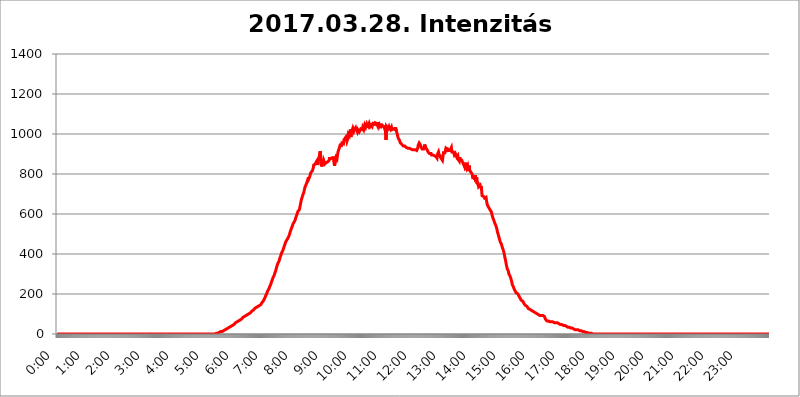
| Category | 2017.03.28. Intenzitás [W/m^2] |
|---|---|
| 0.0 | 0 |
| 0.0006944444444444445 | 0 |
| 0.001388888888888889 | 0 |
| 0.0020833333333333333 | 0 |
| 0.002777777777777778 | 0 |
| 0.003472222222222222 | 0 |
| 0.004166666666666667 | 0 |
| 0.004861111111111111 | 0 |
| 0.005555555555555556 | 0 |
| 0.0062499999999999995 | 0 |
| 0.006944444444444444 | 0 |
| 0.007638888888888889 | 0 |
| 0.008333333333333333 | 0 |
| 0.009027777777777779 | 0 |
| 0.009722222222222222 | 0 |
| 0.010416666666666666 | 0 |
| 0.011111111111111112 | 0 |
| 0.011805555555555555 | 0 |
| 0.012499999999999999 | 0 |
| 0.013194444444444444 | 0 |
| 0.013888888888888888 | 0 |
| 0.014583333333333332 | 0 |
| 0.015277777777777777 | 0 |
| 0.015972222222222224 | 0 |
| 0.016666666666666666 | 0 |
| 0.017361111111111112 | 0 |
| 0.018055555555555557 | 0 |
| 0.01875 | 0 |
| 0.019444444444444445 | 0 |
| 0.02013888888888889 | 0 |
| 0.020833333333333332 | 0 |
| 0.02152777777777778 | 0 |
| 0.022222222222222223 | 0 |
| 0.02291666666666667 | 0 |
| 0.02361111111111111 | 0 |
| 0.024305555555555556 | 0 |
| 0.024999999999999998 | 0 |
| 0.025694444444444447 | 0 |
| 0.02638888888888889 | 0 |
| 0.027083333333333334 | 0 |
| 0.027777777777777776 | 0 |
| 0.02847222222222222 | 0 |
| 0.029166666666666664 | 0 |
| 0.029861111111111113 | 0 |
| 0.030555555555555555 | 0 |
| 0.03125 | 0 |
| 0.03194444444444445 | 0 |
| 0.03263888888888889 | 0 |
| 0.03333333333333333 | 0 |
| 0.034027777777777775 | 0 |
| 0.034722222222222224 | 0 |
| 0.035416666666666666 | 0 |
| 0.036111111111111115 | 0 |
| 0.03680555555555556 | 0 |
| 0.0375 | 0 |
| 0.03819444444444444 | 0 |
| 0.03888888888888889 | 0 |
| 0.03958333333333333 | 0 |
| 0.04027777777777778 | 0 |
| 0.04097222222222222 | 0 |
| 0.041666666666666664 | 0 |
| 0.042361111111111106 | 0 |
| 0.04305555555555556 | 0 |
| 0.043750000000000004 | 0 |
| 0.044444444444444446 | 0 |
| 0.04513888888888889 | 0 |
| 0.04583333333333334 | 0 |
| 0.04652777777777778 | 0 |
| 0.04722222222222222 | 0 |
| 0.04791666666666666 | 0 |
| 0.04861111111111111 | 0 |
| 0.049305555555555554 | 0 |
| 0.049999999999999996 | 0 |
| 0.05069444444444445 | 0 |
| 0.051388888888888894 | 0 |
| 0.052083333333333336 | 0 |
| 0.05277777777777778 | 0 |
| 0.05347222222222222 | 0 |
| 0.05416666666666667 | 0 |
| 0.05486111111111111 | 0 |
| 0.05555555555555555 | 0 |
| 0.05625 | 0 |
| 0.05694444444444444 | 0 |
| 0.057638888888888885 | 0 |
| 0.05833333333333333 | 0 |
| 0.05902777777777778 | 0 |
| 0.059722222222222225 | 0 |
| 0.06041666666666667 | 0 |
| 0.061111111111111116 | 0 |
| 0.06180555555555556 | 0 |
| 0.0625 | 0 |
| 0.06319444444444444 | 0 |
| 0.06388888888888888 | 0 |
| 0.06458333333333334 | 0 |
| 0.06527777777777778 | 0 |
| 0.06597222222222222 | 0 |
| 0.06666666666666667 | 0 |
| 0.06736111111111111 | 0 |
| 0.06805555555555555 | 0 |
| 0.06874999999999999 | 0 |
| 0.06944444444444443 | 0 |
| 0.07013888888888889 | 0 |
| 0.07083333333333333 | 0 |
| 0.07152777777777779 | 0 |
| 0.07222222222222223 | 0 |
| 0.07291666666666667 | 0 |
| 0.07361111111111111 | 0 |
| 0.07430555555555556 | 0 |
| 0.075 | 0 |
| 0.07569444444444444 | 0 |
| 0.0763888888888889 | 0 |
| 0.07708333333333334 | 0 |
| 0.07777777777777778 | 0 |
| 0.07847222222222222 | 0 |
| 0.07916666666666666 | 0 |
| 0.0798611111111111 | 0 |
| 0.08055555555555556 | 0 |
| 0.08125 | 0 |
| 0.08194444444444444 | 0 |
| 0.08263888888888889 | 0 |
| 0.08333333333333333 | 0 |
| 0.08402777777777777 | 0 |
| 0.08472222222222221 | 0 |
| 0.08541666666666665 | 0 |
| 0.08611111111111112 | 0 |
| 0.08680555555555557 | 0 |
| 0.08750000000000001 | 0 |
| 0.08819444444444445 | 0 |
| 0.08888888888888889 | 0 |
| 0.08958333333333333 | 0 |
| 0.09027777777777778 | 0 |
| 0.09097222222222222 | 0 |
| 0.09166666666666667 | 0 |
| 0.09236111111111112 | 0 |
| 0.09305555555555556 | 0 |
| 0.09375 | 0 |
| 0.09444444444444444 | 0 |
| 0.09513888888888888 | 0 |
| 0.09583333333333333 | 0 |
| 0.09652777777777777 | 0 |
| 0.09722222222222222 | 0 |
| 0.09791666666666667 | 0 |
| 0.09861111111111111 | 0 |
| 0.09930555555555555 | 0 |
| 0.09999999999999999 | 0 |
| 0.10069444444444443 | 0 |
| 0.1013888888888889 | 0 |
| 0.10208333333333335 | 0 |
| 0.10277777777777779 | 0 |
| 0.10347222222222223 | 0 |
| 0.10416666666666667 | 0 |
| 0.10486111111111111 | 0 |
| 0.10555555555555556 | 0 |
| 0.10625 | 0 |
| 0.10694444444444444 | 0 |
| 0.1076388888888889 | 0 |
| 0.10833333333333334 | 0 |
| 0.10902777777777778 | 0 |
| 0.10972222222222222 | 0 |
| 0.1111111111111111 | 0 |
| 0.11180555555555556 | 0 |
| 0.11180555555555556 | 0 |
| 0.1125 | 0 |
| 0.11319444444444444 | 0 |
| 0.11388888888888889 | 0 |
| 0.11458333333333333 | 0 |
| 0.11527777777777777 | 0 |
| 0.11597222222222221 | 0 |
| 0.11666666666666665 | 0 |
| 0.1173611111111111 | 0 |
| 0.11805555555555557 | 0 |
| 0.11944444444444445 | 0 |
| 0.12013888888888889 | 0 |
| 0.12083333333333333 | 0 |
| 0.12152777777777778 | 0 |
| 0.12222222222222223 | 0 |
| 0.12291666666666667 | 0 |
| 0.12291666666666667 | 0 |
| 0.12361111111111112 | 0 |
| 0.12430555555555556 | 0 |
| 0.125 | 0 |
| 0.12569444444444444 | 0 |
| 0.12638888888888888 | 0 |
| 0.12708333333333333 | 0 |
| 0.16875 | 0 |
| 0.12847222222222224 | 0 |
| 0.12916666666666668 | 0 |
| 0.12986111111111112 | 0 |
| 0.13055555555555556 | 0 |
| 0.13125 | 0 |
| 0.13194444444444445 | 0 |
| 0.1326388888888889 | 0 |
| 0.13333333333333333 | 0 |
| 0.13402777777777777 | 0 |
| 0.13402777777777777 | 0 |
| 0.13472222222222222 | 0 |
| 0.13541666666666666 | 0 |
| 0.1361111111111111 | 0 |
| 0.13749999999999998 | 0 |
| 0.13819444444444443 | 0 |
| 0.1388888888888889 | 0 |
| 0.13958333333333334 | 0 |
| 0.14027777777777778 | 0 |
| 0.14097222222222222 | 0 |
| 0.14166666666666666 | 0 |
| 0.1423611111111111 | 0 |
| 0.14305555555555557 | 0 |
| 0.14375000000000002 | 0 |
| 0.14444444444444446 | 0 |
| 0.1451388888888889 | 0 |
| 0.1451388888888889 | 0 |
| 0.14652777777777778 | 0 |
| 0.14722222222222223 | 0 |
| 0.14791666666666667 | 0 |
| 0.1486111111111111 | 0 |
| 0.14930555555555555 | 0 |
| 0.15 | 0 |
| 0.15069444444444444 | 0 |
| 0.15138888888888888 | 0 |
| 0.15208333333333332 | 0 |
| 0.15277777777777776 | 0 |
| 0.15347222222222223 | 0 |
| 0.15416666666666667 | 0 |
| 0.15486111111111112 | 0 |
| 0.15555555555555556 | 0 |
| 0.15625 | 0 |
| 0.15694444444444444 | 0 |
| 0.15763888888888888 | 0 |
| 0.15833333333333333 | 0 |
| 0.15902777777777777 | 0 |
| 0.15972222222222224 | 0 |
| 0.16041666666666668 | 0 |
| 0.16111111111111112 | 0 |
| 0.16180555555555556 | 0 |
| 0.1625 | 0 |
| 0.16319444444444445 | 0 |
| 0.1638888888888889 | 0 |
| 0.16458333333333333 | 0 |
| 0.16527777777777777 | 0 |
| 0.16597222222222222 | 0 |
| 0.16666666666666666 | 0 |
| 0.1673611111111111 | 0 |
| 0.16805555555555554 | 0 |
| 0.16874999999999998 | 0 |
| 0.16944444444444443 | 0 |
| 0.17013888888888887 | 0 |
| 0.1708333333333333 | 0 |
| 0.17152777777777775 | 0 |
| 0.17222222222222225 | 0 |
| 0.1729166666666667 | 0 |
| 0.17361111111111113 | 0 |
| 0.17430555555555557 | 0 |
| 0.17500000000000002 | 0 |
| 0.17569444444444446 | 0 |
| 0.1763888888888889 | 0 |
| 0.17708333333333334 | 0 |
| 0.17777777777777778 | 0 |
| 0.17847222222222223 | 0 |
| 0.17916666666666667 | 0 |
| 0.1798611111111111 | 0 |
| 0.18055555555555555 | 0 |
| 0.18125 | 0 |
| 0.18194444444444444 | 0 |
| 0.1826388888888889 | 0 |
| 0.18333333333333335 | 0 |
| 0.1840277777777778 | 0 |
| 0.18472222222222223 | 0 |
| 0.18541666666666667 | 0 |
| 0.18611111111111112 | 0 |
| 0.18680555555555556 | 0 |
| 0.1875 | 0 |
| 0.18819444444444444 | 0 |
| 0.18888888888888888 | 0 |
| 0.18958333333333333 | 0 |
| 0.19027777777777777 | 0 |
| 0.1909722222222222 | 0 |
| 0.19166666666666665 | 0 |
| 0.19236111111111112 | 0 |
| 0.19305555555555554 | 0 |
| 0.19375 | 0 |
| 0.19444444444444445 | 0 |
| 0.1951388888888889 | 0 |
| 0.19583333333333333 | 0 |
| 0.19652777777777777 | 0 |
| 0.19722222222222222 | 0 |
| 0.19791666666666666 | 0 |
| 0.1986111111111111 | 0 |
| 0.19930555555555554 | 0 |
| 0.19999999999999998 | 0 |
| 0.20069444444444443 | 0 |
| 0.20138888888888887 | 0 |
| 0.2020833333333333 | 0 |
| 0.2027777777777778 | 0 |
| 0.2034722222222222 | 0 |
| 0.2041666666666667 | 0 |
| 0.20486111111111113 | 0 |
| 0.20555555555555557 | 0 |
| 0.20625000000000002 | 0 |
| 0.20694444444444446 | 0 |
| 0.2076388888888889 | 0 |
| 0.20833333333333334 | 0 |
| 0.20902777777777778 | 0 |
| 0.20972222222222223 | 0 |
| 0.21041666666666667 | 0 |
| 0.2111111111111111 | 0 |
| 0.21180555555555555 | 0 |
| 0.2125 | 0 |
| 0.21319444444444444 | 0 |
| 0.2138888888888889 | 0 |
| 0.21458333333333335 | 0 |
| 0.2152777777777778 | 0 |
| 0.21597222222222223 | 0 |
| 0.21666666666666667 | 0 |
| 0.21736111111111112 | 0 |
| 0.21805555555555556 | 0 |
| 0.21875 | 0 |
| 0.21944444444444444 | 0 |
| 0.22013888888888888 | 0 |
| 0.22083333333333333 | 0 |
| 0.22152777777777777 | 0 |
| 0.2222222222222222 | 3.525 |
| 0.22291666666666665 | 3.525 |
| 0.2236111111111111 | 3.525 |
| 0.22430555555555556 | 3.525 |
| 0.225 | 3.525 |
| 0.22569444444444445 | 3.525 |
| 0.2263888888888889 | 3.525 |
| 0.22708333333333333 | 7.887 |
| 0.22777777777777777 | 7.887 |
| 0.22847222222222222 | 7.887 |
| 0.22916666666666666 | 12.257 |
| 0.2298611111111111 | 12.257 |
| 0.23055555555555554 | 12.257 |
| 0.23124999999999998 | 12.257 |
| 0.23194444444444443 | 12.257 |
| 0.23263888888888887 | 16.636 |
| 0.2333333333333333 | 16.636 |
| 0.2340277777777778 | 16.636 |
| 0.2347222222222222 | 21.024 |
| 0.2354166666666667 | 21.024 |
| 0.23611111111111113 | 21.024 |
| 0.23680555555555557 | 25.419 |
| 0.23750000000000002 | 25.419 |
| 0.23819444444444446 | 25.419 |
| 0.2388888888888889 | 29.823 |
| 0.23958333333333334 | 29.823 |
| 0.24027777777777778 | 29.823 |
| 0.24097222222222223 | 34.234 |
| 0.24166666666666667 | 34.234 |
| 0.2423611111111111 | 38.653 |
| 0.24305555555555555 | 38.653 |
| 0.24375 | 38.653 |
| 0.24444444444444446 | 43.079 |
| 0.24513888888888888 | 43.079 |
| 0.24583333333333335 | 43.079 |
| 0.2465277777777778 | 47.511 |
| 0.24722222222222223 | 47.511 |
| 0.24791666666666667 | 47.511 |
| 0.24861111111111112 | 51.951 |
| 0.24930555555555556 | 51.951 |
| 0.25 | 56.398 |
| 0.25069444444444444 | 56.398 |
| 0.2513888888888889 | 56.398 |
| 0.2520833333333333 | 60.85 |
| 0.25277777777777777 | 60.85 |
| 0.2534722222222222 | 65.31 |
| 0.25416666666666665 | 65.31 |
| 0.2548611111111111 | 65.31 |
| 0.2555555555555556 | 65.31 |
| 0.25625000000000003 | 69.775 |
| 0.2569444444444445 | 74.246 |
| 0.2576388888888889 | 74.246 |
| 0.25833333333333336 | 74.246 |
| 0.2590277777777778 | 78.722 |
| 0.25972222222222224 | 78.722 |
| 0.2604166666666667 | 83.205 |
| 0.2611111111111111 | 83.205 |
| 0.26180555555555557 | 83.205 |
| 0.2625 | 87.692 |
| 0.26319444444444445 | 87.692 |
| 0.2638888888888889 | 92.184 |
| 0.26458333333333334 | 92.184 |
| 0.2652777777777778 | 92.184 |
| 0.2659722222222222 | 96.682 |
| 0.26666666666666666 | 96.682 |
| 0.2673611111111111 | 101.184 |
| 0.26805555555555555 | 101.184 |
| 0.26875 | 101.184 |
| 0.26944444444444443 | 101.184 |
| 0.2701388888888889 | 105.69 |
| 0.2708333333333333 | 105.69 |
| 0.27152777777777776 | 110.201 |
| 0.2722222222222222 | 110.201 |
| 0.27291666666666664 | 114.716 |
| 0.2736111111111111 | 119.235 |
| 0.2743055555555555 | 119.235 |
| 0.27499999999999997 | 119.235 |
| 0.27569444444444446 | 123.758 |
| 0.27638888888888885 | 123.758 |
| 0.27708333333333335 | 128.284 |
| 0.2777777777777778 | 128.284 |
| 0.27847222222222223 | 128.284 |
| 0.2791666666666667 | 132.814 |
| 0.2798611111111111 | 132.814 |
| 0.28055555555555556 | 137.347 |
| 0.28125 | 137.347 |
| 0.28194444444444444 | 137.347 |
| 0.2826388888888889 | 137.347 |
| 0.2833333333333333 | 141.884 |
| 0.28402777777777777 | 141.884 |
| 0.2847222222222222 | 146.423 |
| 0.28541666666666665 | 146.423 |
| 0.28611111111111115 | 150.964 |
| 0.28680555555555554 | 155.509 |
| 0.28750000000000003 | 155.509 |
| 0.2881944444444445 | 160.056 |
| 0.2888888888888889 | 164.605 |
| 0.28958333333333336 | 164.605 |
| 0.2902777777777778 | 169.156 |
| 0.29097222222222224 | 178.264 |
| 0.2916666666666667 | 182.82 |
| 0.2923611111111111 | 191.937 |
| 0.29305555555555557 | 196.497 |
| 0.29375 | 201.058 |
| 0.29444444444444445 | 210.182 |
| 0.2951388888888889 | 210.182 |
| 0.29583333333333334 | 219.309 |
| 0.2965277777777778 | 223.873 |
| 0.2972222222222222 | 228.436 |
| 0.29791666666666666 | 237.564 |
| 0.2986111111111111 | 242.127 |
| 0.29930555555555555 | 246.689 |
| 0.3 | 255.813 |
| 0.30069444444444443 | 260.373 |
| 0.3013888888888889 | 269.49 |
| 0.3020833333333333 | 274.047 |
| 0.30277777777777776 | 283.156 |
| 0.3034722222222222 | 287.709 |
| 0.30416666666666664 | 292.259 |
| 0.3048611111111111 | 301.354 |
| 0.3055555555555555 | 305.898 |
| 0.30624999999999997 | 314.98 |
| 0.3069444444444444 | 324.052 |
| 0.3076388888888889 | 333.113 |
| 0.30833333333333335 | 342.162 |
| 0.3090277777777778 | 346.682 |
| 0.30972222222222223 | 355.712 |
| 0.3104166666666667 | 360.221 |
| 0.3111111111111111 | 364.728 |
| 0.31180555555555556 | 369.23 |
| 0.3125 | 382.715 |
| 0.31319444444444444 | 387.202 |
| 0.3138888888888889 | 396.164 |
| 0.3145833333333333 | 405.108 |
| 0.31527777777777777 | 405.108 |
| 0.3159722222222222 | 414.035 |
| 0.31666666666666665 | 418.492 |
| 0.31736111111111115 | 427.39 |
| 0.31805555555555554 | 436.27 |
| 0.31875000000000003 | 440.702 |
| 0.3194444444444445 | 449.551 |
| 0.3201388888888889 | 458.38 |
| 0.32083333333333336 | 458.38 |
| 0.3215277777777778 | 467.187 |
| 0.32222222222222224 | 471.582 |
| 0.3229166666666667 | 475.972 |
| 0.3236111111111111 | 480.356 |
| 0.32430555555555557 | 484.735 |
| 0.325 | 489.108 |
| 0.32569444444444445 | 497.836 |
| 0.3263888888888889 | 506.542 |
| 0.32708333333333334 | 515.223 |
| 0.3277777777777778 | 519.555 |
| 0.3284722222222222 | 528.2 |
| 0.32916666666666666 | 532.513 |
| 0.3298611111111111 | 541.121 |
| 0.33055555555555555 | 549.704 |
| 0.33125 | 553.986 |
| 0.33194444444444443 | 558.261 |
| 0.3326388888888889 | 558.261 |
| 0.3333333333333333 | 566.793 |
| 0.3340277777777778 | 575.299 |
| 0.3347222222222222 | 583.779 |
| 0.3354166666666667 | 588.009 |
| 0.3361111111111111 | 596.45 |
| 0.3368055555555556 | 600.661 |
| 0.33749999999999997 | 613.252 |
| 0.33819444444444446 | 613.252 |
| 0.33888888888888885 | 617.436 |
| 0.33958333333333335 | 621.613 |
| 0.34027777777777773 | 634.105 |
| 0.34097222222222223 | 646.537 |
| 0.3416666666666666 | 658.909 |
| 0.3423611111111111 | 671.22 |
| 0.3430555555555555 | 675.311 |
| 0.34375 | 687.544 |
| 0.3444444444444445 | 695.666 |
| 0.3451388888888889 | 699.717 |
| 0.3458333333333334 | 707.8 |
| 0.34652777777777777 | 719.877 |
| 0.34722222222222227 | 731.896 |
| 0.34791666666666665 | 735.89 |
| 0.34861111111111115 | 743.859 |
| 0.34930555555555554 | 743.859 |
| 0.35000000000000003 | 755.766 |
| 0.3506944444444444 | 759.723 |
| 0.3513888888888889 | 771.559 |
| 0.3520833333333333 | 783.342 |
| 0.3527777777777778 | 775.492 |
| 0.3534722222222222 | 775.492 |
| 0.3541666666666667 | 787.258 |
| 0.3548611111111111 | 791.169 |
| 0.35555555555555557 | 806.757 |
| 0.35625 | 806.757 |
| 0.35694444444444445 | 810.641 |
| 0.3576388888888889 | 814.519 |
| 0.35833333333333334 | 818.392 |
| 0.3590277777777778 | 829.981 |
| 0.3597222222222222 | 845.365 |
| 0.36041666666666666 | 841.526 |
| 0.3611111111111111 | 841.526 |
| 0.36180555555555555 | 849.199 |
| 0.3625 | 853.029 |
| 0.36319444444444443 | 860.676 |
| 0.3638888888888889 | 860.676 |
| 0.3645833333333333 | 868.305 |
| 0.3652777777777778 | 845.365 |
| 0.3659722222222222 | 856.855 |
| 0.3666666666666667 | 872.114 |
| 0.3673611111111111 | 868.305 |
| 0.3680555555555556 | 868.305 |
| 0.36874999999999997 | 913.766 |
| 0.36944444444444446 | 891.099 |
| 0.37013888888888885 | 887.309 |
| 0.37083333333333335 | 837.682 |
| 0.37152777777777773 | 860.676 |
| 0.37222222222222223 | 845.365 |
| 0.3729166666666666 | 845.365 |
| 0.3736111111111111 | 868.305 |
| 0.3743055555555555 | 860.676 |
| 0.375 | 849.199 |
| 0.3756944444444445 | 853.029 |
| 0.3763888888888889 | 853.029 |
| 0.3770833333333334 | 856.855 |
| 0.37777777777777777 | 860.676 |
| 0.37847222222222227 | 860.676 |
| 0.37916666666666665 | 860.676 |
| 0.37986111111111115 | 864.493 |
| 0.38055555555555554 | 864.493 |
| 0.38125000000000003 | 868.305 |
| 0.3819444444444444 | 883.516 |
| 0.3826388888888889 | 875.918 |
| 0.3833333333333333 | 875.918 |
| 0.3840277777777778 | 879.719 |
| 0.3847222222222222 | 879.719 |
| 0.3854166666666667 | 879.719 |
| 0.3861111111111111 | 883.516 |
| 0.38680555555555557 | 875.918 |
| 0.3875 | 887.309 |
| 0.38819444444444445 | 883.516 |
| 0.3888888888888889 | 841.526 |
| 0.38958333333333334 | 837.682 |
| 0.3902777777777778 | 872.114 |
| 0.3909722222222222 | 883.516 |
| 0.39166666666666666 | 887.309 |
| 0.3923611111111111 | 875.918 |
| 0.39305555555555555 | 894.885 |
| 0.39375 | 909.996 |
| 0.39444444444444443 | 909.996 |
| 0.3951388888888889 | 925.06 |
| 0.3958333333333333 | 925.06 |
| 0.3965277777777778 | 940.082 |
| 0.3972222222222222 | 951.327 |
| 0.3979166666666667 | 936.33 |
| 0.3986111111111111 | 943.832 |
| 0.3993055555555556 | 955.071 |
| 0.39999999999999997 | 958.814 |
| 0.40069444444444446 | 951.327 |
| 0.40138888888888885 | 951.327 |
| 0.40208333333333335 | 970.034 |
| 0.40277777777777773 | 966.295 |
| 0.40347222222222223 | 966.295 |
| 0.4041666666666666 | 981.244 |
| 0.4048611111111111 | 966.295 |
| 0.4055555555555555 | 973.772 |
| 0.40625 | 962.555 |
| 0.4069444444444445 | 962.555 |
| 0.4076388888888889 | 977.508 |
| 0.4083333333333334 | 999.916 |
| 0.40902777777777777 | 999.916 |
| 0.40972222222222227 | 992.448 |
| 0.41041666666666665 | 988.714 |
| 0.41111111111111115 | 1022.323 |
| 0.41180555555555554 | 984.98 |
| 0.41250000000000003 | 1003.65 |
| 0.4131944444444444 | 1014.852 |
| 0.4138888888888889 | 1011.118 |
| 0.4145833333333333 | 1029.798 |
| 0.4152777777777778 | 1033.537 |
| 0.4159722222222222 | 1014.852 |
| 0.4166666666666667 | 1022.323 |
| 0.4173611111111111 | 1022.323 |
| 0.41805555555555557 | 1029.798 |
| 0.41875 | 1014.852 |
| 0.41944444444444445 | 1022.323 |
| 0.4201388888888889 | 1026.06 |
| 0.42083333333333334 | 1011.118 |
| 0.4215277777777778 | 1022.323 |
| 0.4222222222222222 | 1022.323 |
| 0.42291666666666666 | 1022.323 |
| 0.4236111111111111 | 1011.118 |
| 0.42430555555555555 | 1011.118 |
| 0.425 | 1011.118 |
| 0.42569444444444443 | 1026.06 |
| 0.4263888888888889 | 1022.323 |
| 0.4270833333333333 | 1029.798 |
| 0.4277777777777778 | 1022.323 |
| 0.4284722222222222 | 1033.537 |
| 0.4291666666666667 | 1033.537 |
| 0.4298611111111111 | 1022.323 |
| 0.4305555555555556 | 1033.537 |
| 0.43124999999999997 | 1044.762 |
| 0.43194444444444446 | 1041.019 |
| 0.43263888888888885 | 1033.537 |
| 0.43333333333333335 | 1033.537 |
| 0.43402777777777773 | 1048.508 |
| 0.43472222222222223 | 1041.019 |
| 0.4354166666666666 | 1029.798 |
| 0.4361111111111111 | 1052.255 |
| 0.4368055555555555 | 1044.762 |
| 0.4375 | 1052.255 |
| 0.4381944444444445 | 1052.255 |
| 0.4388888888888889 | 1037.277 |
| 0.4395833333333334 | 1037.277 |
| 0.44027777777777777 | 1044.762 |
| 0.44097222222222227 | 1044.762 |
| 0.44166666666666665 | 1037.277 |
| 0.44236111111111115 | 1044.762 |
| 0.44305555555555554 | 1052.255 |
| 0.44375000000000003 | 1048.508 |
| 0.4444444444444444 | 1052.255 |
| 0.4451388888888889 | 1048.508 |
| 0.4458333333333333 | 1056.004 |
| 0.4465277777777778 | 1052.255 |
| 0.4472222222222222 | 1056.004 |
| 0.4479166666666667 | 1052.255 |
| 0.4486111111111111 | 1052.255 |
| 0.44930555555555557 | 1041.019 |
| 0.45 | 1059.756 |
| 0.45069444444444445 | 1048.508 |
| 0.4513888888888889 | 1041.019 |
| 0.45208333333333334 | 1048.508 |
| 0.4527777777777778 | 1044.762 |
| 0.4534722222222222 | 1044.762 |
| 0.45416666666666666 | 1037.277 |
| 0.4548611111111111 | 1041.019 |
| 0.45555555555555555 | 1044.762 |
| 0.45625 | 1044.762 |
| 0.45694444444444443 | 1044.762 |
| 0.4576388888888889 | 1037.277 |
| 0.4583333333333333 | 1033.537 |
| 0.4590277777777778 | 1029.798 |
| 0.4597222222222222 | 1044.762 |
| 0.4604166666666667 | 1003.65 |
| 0.4611111111111111 | 970.034 |
| 0.4618055555555556 | 1037.277 |
| 0.46249999999999997 | 1041.019 |
| 0.46319444444444446 | 1037.277 |
| 0.46388888888888885 | 1026.06 |
| 0.46458333333333335 | 1022.323 |
| 0.46527777777777773 | 1037.277 |
| 0.46597222222222223 | 1029.798 |
| 0.4666666666666666 | 1026.06 |
| 0.4673611111111111 | 1022.323 |
| 0.4680555555555555 | 1022.323 |
| 0.46875 | 1033.537 |
| 0.4694444444444445 | 1022.323 |
| 0.4701388888888889 | 1026.06 |
| 0.4708333333333334 | 1026.06 |
| 0.47152777777777777 | 1026.06 |
| 0.47222222222222227 | 1029.798 |
| 0.47291666666666665 | 1022.323 |
| 0.47361111111111115 | 1022.323 |
| 0.47430555555555554 | 1033.537 |
| 0.47500000000000003 | 1033.537 |
| 0.4756944444444444 | 1014.852 |
| 0.4763888888888889 | 1011.118 |
| 0.4770833333333333 | 996.182 |
| 0.4777777777777778 | 984.98 |
| 0.4784722222222222 | 977.508 |
| 0.4791666666666667 | 973.772 |
| 0.4798611111111111 | 970.034 |
| 0.48055555555555557 | 962.555 |
| 0.48125 | 955.071 |
| 0.48194444444444445 | 955.071 |
| 0.4826388888888889 | 955.071 |
| 0.48333333333333334 | 947.58 |
| 0.4840277777777778 | 947.58 |
| 0.4847222222222222 | 943.832 |
| 0.48541666666666666 | 940.082 |
| 0.4861111111111111 | 936.33 |
| 0.48680555555555555 | 940.082 |
| 0.4875 | 940.082 |
| 0.48819444444444443 | 940.082 |
| 0.4888888888888889 | 936.33 |
| 0.4895833333333333 | 932.576 |
| 0.4902777777777778 | 932.576 |
| 0.4909722222222222 | 928.819 |
| 0.4916666666666667 | 928.819 |
| 0.4923611111111111 | 928.819 |
| 0.4930555555555556 | 925.06 |
| 0.49374999999999997 | 928.819 |
| 0.49444444444444446 | 925.06 |
| 0.49513888888888885 | 925.06 |
| 0.49583333333333335 | 925.06 |
| 0.49652777777777773 | 928.819 |
| 0.49722222222222223 | 928.819 |
| 0.4979166666666666 | 921.298 |
| 0.4986111111111111 | 921.298 |
| 0.4993055555555555 | 921.298 |
| 0.5 | 921.298 |
| 0.5006944444444444 | 925.06 |
| 0.5013888888888889 | 921.298 |
| 0.5020833333333333 | 921.298 |
| 0.5027777777777778 | 917.534 |
| 0.5034722222222222 | 921.298 |
| 0.5041666666666667 | 917.534 |
| 0.5048611111111111 | 917.534 |
| 0.5055555555555555 | 928.819 |
| 0.50625 | 943.832 |
| 0.5069444444444444 | 947.58 |
| 0.5076388888888889 | 955.071 |
| 0.5083333333333333 | 951.327 |
| 0.5090277777777777 | 947.58 |
| 0.5097222222222222 | 940.082 |
| 0.5104166666666666 | 932.576 |
| 0.5111111111111112 | 932.576 |
| 0.5118055555555555 | 925.06 |
| 0.5125000000000001 | 921.298 |
| 0.5131944444444444 | 921.298 |
| 0.513888888888889 | 925.06 |
| 0.5145833333333333 | 932.576 |
| 0.5152777777777778 | 947.58 |
| 0.5159722222222222 | 943.832 |
| 0.5166666666666667 | 932.576 |
| 0.517361111111111 | 932.576 |
| 0.5180555555555556 | 928.819 |
| 0.5187499999999999 | 921.298 |
| 0.5194444444444445 | 917.534 |
| 0.5201388888888888 | 909.996 |
| 0.5208333333333334 | 909.996 |
| 0.5215277777777778 | 909.996 |
| 0.5222222222222223 | 902.447 |
| 0.5229166666666667 | 902.447 |
| 0.5236111111111111 | 898.668 |
| 0.5243055555555556 | 902.447 |
| 0.525 | 894.885 |
| 0.5256944444444445 | 894.885 |
| 0.5263888888888889 | 894.885 |
| 0.5270833333333333 | 894.885 |
| 0.5277777777777778 | 894.885 |
| 0.5284722222222222 | 894.885 |
| 0.5291666666666667 | 891.099 |
| 0.5298611111111111 | 891.099 |
| 0.5305555555555556 | 887.309 |
| 0.53125 | 887.309 |
| 0.5319444444444444 | 883.516 |
| 0.5326388888888889 | 879.719 |
| 0.5333333333333333 | 898.668 |
| 0.5340277777777778 | 894.885 |
| 0.5347222222222222 | 909.996 |
| 0.5354166666666667 | 898.668 |
| 0.5361111111111111 | 894.885 |
| 0.5368055555555555 | 891.099 |
| 0.5375 | 883.516 |
| 0.5381944444444444 | 879.719 |
| 0.5388888888888889 | 875.918 |
| 0.5395833333333333 | 872.114 |
| 0.5402777777777777 | 868.305 |
| 0.5409722222222222 | 868.305 |
| 0.5416666666666666 | 906.223 |
| 0.5423611111111112 | 902.447 |
| 0.5430555555555555 | 909.996 |
| 0.5437500000000001 | 906.223 |
| 0.5444444444444444 | 917.534 |
| 0.545138888888889 | 909.996 |
| 0.5458333333333333 | 928.819 |
| 0.5465277777777778 | 932.576 |
| 0.5472222222222222 | 928.819 |
| 0.5479166666666667 | 925.06 |
| 0.548611111111111 | 917.534 |
| 0.5493055555555556 | 917.534 |
| 0.5499999999999999 | 913.766 |
| 0.5506944444444445 | 917.534 |
| 0.5513888888888888 | 917.534 |
| 0.5520833333333334 | 917.534 |
| 0.5527777777777778 | 932.576 |
| 0.5534722222222223 | 909.996 |
| 0.5541666666666667 | 906.223 |
| 0.5548611111111111 | 913.766 |
| 0.5555555555555556 | 909.996 |
| 0.55625 | 906.223 |
| 0.5569444444444445 | 894.885 |
| 0.5576388888888889 | 894.885 |
| 0.5583333333333333 | 902.447 |
| 0.5590277777777778 | 898.668 |
| 0.5597222222222222 | 902.447 |
| 0.5604166666666667 | 883.516 |
| 0.5611111111111111 | 887.309 |
| 0.5618055555555556 | 891.099 |
| 0.5625 | 872.114 |
| 0.5631944444444444 | 868.305 |
| 0.5638888888888889 | 864.493 |
| 0.5645833333333333 | 883.516 |
| 0.5652777777777778 | 868.305 |
| 0.5659722222222222 | 868.305 |
| 0.5666666666666667 | 864.493 |
| 0.5673611111111111 | 868.305 |
| 0.5680555555555555 | 872.114 |
| 0.56875 | 856.855 |
| 0.5694444444444444 | 853.029 |
| 0.5701388888888889 | 845.365 |
| 0.5708333333333333 | 845.365 |
| 0.5715277777777777 | 856.855 |
| 0.5722222222222222 | 833.834 |
| 0.5729166666666666 | 837.682 |
| 0.5736111111111112 | 841.526 |
| 0.5743055555555555 | 829.981 |
| 0.5750000000000001 | 833.834 |
| 0.5756944444444444 | 841.526 |
| 0.576388888888889 | 826.123 |
| 0.5770833333333333 | 814.519 |
| 0.5777777777777778 | 841.526 |
| 0.5784722222222222 | 818.392 |
| 0.5791666666666667 | 814.519 |
| 0.579861111111111 | 810.641 |
| 0.5805555555555556 | 814.519 |
| 0.5812499999999999 | 806.757 |
| 0.5819444444444445 | 798.974 |
| 0.5826388888888888 | 783.342 |
| 0.5833333333333334 | 775.492 |
| 0.5840277777777778 | 787.258 |
| 0.5847222222222223 | 787.258 |
| 0.5854166666666667 | 771.559 |
| 0.5861111111111111 | 795.074 |
| 0.5868055555555556 | 759.723 |
| 0.5875 | 775.492 |
| 0.5881944444444445 | 783.342 |
| 0.5888888888888889 | 751.803 |
| 0.5895833333333333 | 759.723 |
| 0.5902777777777778 | 755.766 |
| 0.5909722222222222 | 735.89 |
| 0.5916666666666667 | 735.89 |
| 0.5923611111111111 | 731.896 |
| 0.5930555555555556 | 743.859 |
| 0.59375 | 731.896 |
| 0.5944444444444444 | 739.877 |
| 0.5951388888888889 | 719.877 |
| 0.5958333333333333 | 691.608 |
| 0.5965277777777778 | 691.608 |
| 0.5972222222222222 | 691.608 |
| 0.5979166666666667 | 687.544 |
| 0.5986111111111111 | 687.544 |
| 0.5993055555555555 | 679.395 |
| 0.6 | 683.473 |
| 0.6006944444444444 | 675.311 |
| 0.6013888888888889 | 683.473 |
| 0.6020833333333333 | 683.473 |
| 0.6027777777777777 | 650.667 |
| 0.6034722222222222 | 654.791 |
| 0.6041666666666666 | 638.256 |
| 0.6048611111111112 | 634.105 |
| 0.6055555555555555 | 629.948 |
| 0.6062500000000001 | 634.105 |
| 0.6069444444444444 | 629.948 |
| 0.607638888888889 | 617.436 |
| 0.6083333333333333 | 613.252 |
| 0.6090277777777778 | 609.062 |
| 0.6097222222222222 | 596.45 |
| 0.6104166666666667 | 588.009 |
| 0.611111111111111 | 579.542 |
| 0.6118055555555556 | 575.299 |
| 0.6124999999999999 | 566.793 |
| 0.6131944444444445 | 558.261 |
| 0.6138888888888888 | 558.261 |
| 0.6145833333333334 | 553.986 |
| 0.6152777777777778 | 541.121 |
| 0.6159722222222223 | 532.513 |
| 0.6166666666666667 | 523.88 |
| 0.6173611111111111 | 510.885 |
| 0.6180555555555556 | 502.192 |
| 0.61875 | 493.475 |
| 0.6194444444444445 | 484.735 |
| 0.6201388888888889 | 475.972 |
| 0.6208333333333333 | 471.582 |
| 0.6215277777777778 | 458.38 |
| 0.6222222222222222 | 453.968 |
| 0.6229166666666667 | 449.551 |
| 0.6236111111111111 | 440.702 |
| 0.6243055555555556 | 431.833 |
| 0.625 | 431.833 |
| 0.6256944444444444 | 418.492 |
| 0.6263888888888889 | 409.574 |
| 0.6270833333333333 | 396.164 |
| 0.6277777777777778 | 382.715 |
| 0.6284722222222222 | 373.729 |
| 0.6291666666666667 | 360.221 |
| 0.6298611111111111 | 346.682 |
| 0.6305555555555555 | 342.162 |
| 0.63125 | 324.052 |
| 0.6319444444444444 | 319.517 |
| 0.6326388888888889 | 314.98 |
| 0.6333333333333333 | 301.354 |
| 0.6340277777777777 | 296.808 |
| 0.6347222222222222 | 292.259 |
| 0.6354166666666666 | 287.709 |
| 0.6361111111111112 | 278.603 |
| 0.6368055555555555 | 269.49 |
| 0.6375000000000001 | 260.373 |
| 0.6381944444444444 | 246.689 |
| 0.638888888888889 | 246.689 |
| 0.6395833333333333 | 237.564 |
| 0.6402777777777778 | 233 |
| 0.6409722222222222 | 223.873 |
| 0.6416666666666667 | 219.309 |
| 0.642361111111111 | 214.746 |
| 0.6430555555555556 | 210.182 |
| 0.6437499999999999 | 205.62 |
| 0.6444444444444445 | 201.058 |
| 0.6451388888888888 | 201.058 |
| 0.6458333333333334 | 201.058 |
| 0.6465277777777778 | 196.497 |
| 0.6472222222222223 | 191.937 |
| 0.6479166666666667 | 187.378 |
| 0.6486111111111111 | 182.82 |
| 0.6493055555555556 | 178.264 |
| 0.65 | 178.264 |
| 0.6506944444444445 | 169.156 |
| 0.6513888888888889 | 169.156 |
| 0.6520833333333333 | 169.156 |
| 0.6527777777777778 | 164.605 |
| 0.6534722222222222 | 164.605 |
| 0.6541666666666667 | 160.056 |
| 0.6548611111111111 | 150.964 |
| 0.6555555555555556 | 146.423 |
| 0.65625 | 146.423 |
| 0.6569444444444444 | 141.884 |
| 0.6576388888888889 | 137.347 |
| 0.6583333333333333 | 137.347 |
| 0.6590277777777778 | 137.347 |
| 0.6597222222222222 | 132.814 |
| 0.6604166666666667 | 128.284 |
| 0.6611111111111111 | 128.284 |
| 0.6618055555555555 | 123.758 |
| 0.6625 | 123.758 |
| 0.6631944444444444 | 123.758 |
| 0.6638888888888889 | 119.235 |
| 0.6645833333333333 | 119.235 |
| 0.6652777777777777 | 119.235 |
| 0.6659722222222222 | 114.716 |
| 0.6666666666666666 | 114.716 |
| 0.6673611111111111 | 110.201 |
| 0.6680555555555556 | 110.201 |
| 0.6687500000000001 | 110.201 |
| 0.6694444444444444 | 105.69 |
| 0.6701388888888888 | 105.69 |
| 0.6708333333333334 | 105.69 |
| 0.6715277777777778 | 105.69 |
| 0.6722222222222222 | 105.69 |
| 0.6729166666666666 | 101.184 |
| 0.6736111111111112 | 101.184 |
| 0.6743055555555556 | 96.682 |
| 0.6749999999999999 | 96.682 |
| 0.6756944444444444 | 101.184 |
| 0.6763888888888889 | 96.682 |
| 0.6770833333333334 | 92.184 |
| 0.6777777777777777 | 96.682 |
| 0.6784722222222223 | 92.184 |
| 0.6791666666666667 | 92.184 |
| 0.6798611111111111 | 92.184 |
| 0.6805555555555555 | 92.184 |
| 0.68125 | 92.184 |
| 0.6819444444444445 | 92.184 |
| 0.6826388888888889 | 87.692 |
| 0.6833333333333332 | 87.692 |
| 0.6840277777777778 | 83.205 |
| 0.6847222222222222 | 74.246 |
| 0.6854166666666667 | 74.246 |
| 0.686111111111111 | 69.775 |
| 0.6868055555555556 | 65.31 |
| 0.6875 | 65.31 |
| 0.6881944444444444 | 65.31 |
| 0.688888888888889 | 65.31 |
| 0.6895833333333333 | 65.31 |
| 0.6902777777777778 | 65.31 |
| 0.6909722222222222 | 60.85 |
| 0.6916666666666668 | 60.85 |
| 0.6923611111111111 | 60.85 |
| 0.6930555555555555 | 60.85 |
| 0.69375 | 60.85 |
| 0.6944444444444445 | 60.85 |
| 0.6951388888888889 | 60.85 |
| 0.6958333333333333 | 60.85 |
| 0.6965277777777777 | 56.398 |
| 0.6972222222222223 | 56.398 |
| 0.6979166666666666 | 56.398 |
| 0.6986111111111111 | 56.398 |
| 0.6993055555555556 | 56.398 |
| 0.7000000000000001 | 56.398 |
| 0.7006944444444444 | 56.398 |
| 0.7013888888888888 | 56.398 |
| 0.7020833333333334 | 51.951 |
| 0.7027777777777778 | 51.951 |
| 0.7034722222222222 | 51.951 |
| 0.7041666666666666 | 51.951 |
| 0.7048611111111112 | 51.951 |
| 0.7055555555555556 | 47.511 |
| 0.7062499999999999 | 47.511 |
| 0.7069444444444444 | 47.511 |
| 0.7076388888888889 | 47.511 |
| 0.7083333333333334 | 47.511 |
| 0.7090277777777777 | 47.511 |
| 0.7097222222222223 | 43.079 |
| 0.7104166666666667 | 43.079 |
| 0.7111111111111111 | 43.079 |
| 0.7118055555555555 | 43.079 |
| 0.7125 | 38.653 |
| 0.7131944444444445 | 38.653 |
| 0.7138888888888889 | 38.653 |
| 0.7145833333333332 | 38.653 |
| 0.7152777777777778 | 38.653 |
| 0.7159722222222222 | 34.234 |
| 0.7166666666666667 | 34.234 |
| 0.717361111111111 | 34.234 |
| 0.7180555555555556 | 34.234 |
| 0.71875 | 34.234 |
| 0.7194444444444444 | 29.823 |
| 0.720138888888889 | 29.823 |
| 0.7208333333333333 | 29.823 |
| 0.7215277777777778 | 29.823 |
| 0.7222222222222222 | 29.823 |
| 0.7229166666666668 | 29.823 |
| 0.7236111111111111 | 25.419 |
| 0.7243055555555555 | 25.419 |
| 0.725 | 25.419 |
| 0.7256944444444445 | 25.419 |
| 0.7263888888888889 | 21.024 |
| 0.7270833333333333 | 21.024 |
| 0.7277777777777777 | 21.024 |
| 0.7284722222222223 | 21.024 |
| 0.7291666666666666 | 21.024 |
| 0.7298611111111111 | 21.024 |
| 0.7305555555555556 | 21.024 |
| 0.7312500000000001 | 21.024 |
| 0.7319444444444444 | 16.636 |
| 0.7326388888888888 | 16.636 |
| 0.7333333333333334 | 16.636 |
| 0.7340277777777778 | 16.636 |
| 0.7347222222222222 | 16.636 |
| 0.7354166666666666 | 12.257 |
| 0.7361111111111112 | 12.257 |
| 0.7368055555555556 | 12.257 |
| 0.7374999999999999 | 12.257 |
| 0.7381944444444444 | 12.257 |
| 0.7388888888888889 | 12.257 |
| 0.7395833333333334 | 7.887 |
| 0.7402777777777777 | 7.887 |
| 0.7409722222222223 | 7.887 |
| 0.7416666666666667 | 7.887 |
| 0.7423611111111111 | 7.887 |
| 0.7430555555555555 | 7.887 |
| 0.74375 | 7.887 |
| 0.7444444444444445 | 3.525 |
| 0.7451388888888889 | 3.525 |
| 0.7458333333333332 | 3.525 |
| 0.7465277777777778 | 3.525 |
| 0.7472222222222222 | 3.525 |
| 0.7479166666666667 | 3.525 |
| 0.748611111111111 | 3.525 |
| 0.7493055555555556 | 3.525 |
| 0.75 | 0 |
| 0.7506944444444444 | 0 |
| 0.751388888888889 | 0 |
| 0.7520833333333333 | 0 |
| 0.7527777777777778 | 0 |
| 0.7534722222222222 | 0 |
| 0.7541666666666668 | 0 |
| 0.7548611111111111 | 0 |
| 0.7555555555555555 | 0 |
| 0.75625 | 0 |
| 0.7569444444444445 | 0 |
| 0.7576388888888889 | 0 |
| 0.7583333333333333 | 0 |
| 0.7590277777777777 | 0 |
| 0.7597222222222223 | 0 |
| 0.7604166666666666 | 0 |
| 0.7611111111111111 | 0 |
| 0.7618055555555556 | 0 |
| 0.7625000000000001 | 0 |
| 0.7631944444444444 | 0 |
| 0.7638888888888888 | 0 |
| 0.7645833333333334 | 0 |
| 0.7652777777777778 | 0 |
| 0.7659722222222222 | 0 |
| 0.7666666666666666 | 0 |
| 0.7673611111111112 | 0 |
| 0.7680555555555556 | 0 |
| 0.7687499999999999 | 0 |
| 0.7694444444444444 | 0 |
| 0.7701388888888889 | 0 |
| 0.7708333333333334 | 0 |
| 0.7715277777777777 | 0 |
| 0.7722222222222223 | 0 |
| 0.7729166666666667 | 0 |
| 0.7736111111111111 | 0 |
| 0.7743055555555555 | 0 |
| 0.775 | 0 |
| 0.7756944444444445 | 0 |
| 0.7763888888888889 | 0 |
| 0.7770833333333332 | 0 |
| 0.7777777777777778 | 0 |
| 0.7784722222222222 | 0 |
| 0.7791666666666667 | 0 |
| 0.779861111111111 | 0 |
| 0.7805555555555556 | 0 |
| 0.78125 | 0 |
| 0.7819444444444444 | 0 |
| 0.782638888888889 | 0 |
| 0.7833333333333333 | 0 |
| 0.7840277777777778 | 0 |
| 0.7847222222222222 | 0 |
| 0.7854166666666668 | 0 |
| 0.7861111111111111 | 0 |
| 0.7868055555555555 | 0 |
| 0.7875 | 0 |
| 0.7881944444444445 | 0 |
| 0.7888888888888889 | 0 |
| 0.7895833333333333 | 0 |
| 0.7902777777777777 | 0 |
| 0.7909722222222223 | 0 |
| 0.7916666666666666 | 0 |
| 0.7923611111111111 | 0 |
| 0.7930555555555556 | 0 |
| 0.7937500000000001 | 0 |
| 0.7944444444444444 | 0 |
| 0.7951388888888888 | 0 |
| 0.7958333333333334 | 0 |
| 0.7965277777777778 | 0 |
| 0.7972222222222222 | 0 |
| 0.7979166666666666 | 0 |
| 0.7986111111111112 | 0 |
| 0.7993055555555556 | 0 |
| 0.7999999999999999 | 0 |
| 0.8006944444444444 | 0 |
| 0.8013888888888889 | 0 |
| 0.8020833333333334 | 0 |
| 0.8027777777777777 | 0 |
| 0.8034722222222223 | 0 |
| 0.8041666666666667 | 0 |
| 0.8048611111111111 | 0 |
| 0.8055555555555555 | 0 |
| 0.80625 | 0 |
| 0.8069444444444445 | 0 |
| 0.8076388888888889 | 0 |
| 0.8083333333333332 | 0 |
| 0.8090277777777778 | 0 |
| 0.8097222222222222 | 0 |
| 0.8104166666666667 | 0 |
| 0.811111111111111 | 0 |
| 0.8118055555555556 | 0 |
| 0.8125 | 0 |
| 0.8131944444444444 | 0 |
| 0.813888888888889 | 0 |
| 0.8145833333333333 | 0 |
| 0.8152777777777778 | 0 |
| 0.8159722222222222 | 0 |
| 0.8166666666666668 | 0 |
| 0.8173611111111111 | 0 |
| 0.8180555555555555 | 0 |
| 0.81875 | 0 |
| 0.8194444444444445 | 0 |
| 0.8201388888888889 | 0 |
| 0.8208333333333333 | 0 |
| 0.8215277777777777 | 0 |
| 0.8222222222222223 | 0 |
| 0.8229166666666666 | 0 |
| 0.8236111111111111 | 0 |
| 0.8243055555555556 | 0 |
| 0.8250000000000001 | 0 |
| 0.8256944444444444 | 0 |
| 0.8263888888888888 | 0 |
| 0.8270833333333334 | 0 |
| 0.8277777777777778 | 0 |
| 0.8284722222222222 | 0 |
| 0.8291666666666666 | 0 |
| 0.8298611111111112 | 0 |
| 0.8305555555555556 | 0 |
| 0.8312499999999999 | 0 |
| 0.8319444444444444 | 0 |
| 0.8326388888888889 | 0 |
| 0.8333333333333334 | 0 |
| 0.8340277777777777 | 0 |
| 0.8347222222222223 | 0 |
| 0.8354166666666667 | 0 |
| 0.8361111111111111 | 0 |
| 0.8368055555555555 | 0 |
| 0.8375 | 0 |
| 0.8381944444444445 | 0 |
| 0.8388888888888889 | 0 |
| 0.8395833333333332 | 0 |
| 0.8402777777777778 | 0 |
| 0.8409722222222222 | 0 |
| 0.8416666666666667 | 0 |
| 0.842361111111111 | 0 |
| 0.8430555555555556 | 0 |
| 0.84375 | 0 |
| 0.8444444444444444 | 0 |
| 0.845138888888889 | 0 |
| 0.8458333333333333 | 0 |
| 0.8465277777777778 | 0 |
| 0.8472222222222222 | 0 |
| 0.8479166666666668 | 0 |
| 0.8486111111111111 | 0 |
| 0.8493055555555555 | 0 |
| 0.85 | 0 |
| 0.8506944444444445 | 0 |
| 0.8513888888888889 | 0 |
| 0.8520833333333333 | 0 |
| 0.8527777777777777 | 0 |
| 0.8534722222222223 | 0 |
| 0.8541666666666666 | 0 |
| 0.8548611111111111 | 0 |
| 0.8555555555555556 | 0 |
| 0.8562500000000001 | 0 |
| 0.8569444444444444 | 0 |
| 0.8576388888888888 | 0 |
| 0.8583333333333334 | 0 |
| 0.8590277777777778 | 0 |
| 0.8597222222222222 | 0 |
| 0.8604166666666666 | 0 |
| 0.8611111111111112 | 0 |
| 0.8618055555555556 | 0 |
| 0.8624999999999999 | 0 |
| 0.8631944444444444 | 0 |
| 0.8638888888888889 | 0 |
| 0.8645833333333334 | 0 |
| 0.8652777777777777 | 0 |
| 0.8659722222222223 | 0 |
| 0.8666666666666667 | 0 |
| 0.8673611111111111 | 0 |
| 0.8680555555555555 | 0 |
| 0.86875 | 0 |
| 0.8694444444444445 | 0 |
| 0.8701388888888889 | 0 |
| 0.8708333333333332 | 0 |
| 0.8715277777777778 | 0 |
| 0.8722222222222222 | 0 |
| 0.8729166666666667 | 0 |
| 0.873611111111111 | 0 |
| 0.8743055555555556 | 0 |
| 0.875 | 0 |
| 0.8756944444444444 | 0 |
| 0.876388888888889 | 0 |
| 0.8770833333333333 | 0 |
| 0.8777777777777778 | 0 |
| 0.8784722222222222 | 0 |
| 0.8791666666666668 | 0 |
| 0.8798611111111111 | 0 |
| 0.8805555555555555 | 0 |
| 0.88125 | 0 |
| 0.8819444444444445 | 0 |
| 0.8826388888888889 | 0 |
| 0.8833333333333333 | 0 |
| 0.8840277777777777 | 0 |
| 0.8847222222222223 | 0 |
| 0.8854166666666666 | 0 |
| 0.8861111111111111 | 0 |
| 0.8868055555555556 | 0 |
| 0.8875000000000001 | 0 |
| 0.8881944444444444 | 0 |
| 0.8888888888888888 | 0 |
| 0.8895833333333334 | 0 |
| 0.8902777777777778 | 0 |
| 0.8909722222222222 | 0 |
| 0.8916666666666666 | 0 |
| 0.8923611111111112 | 0 |
| 0.8930555555555556 | 0 |
| 0.8937499999999999 | 0 |
| 0.8944444444444444 | 0 |
| 0.8951388888888889 | 0 |
| 0.8958333333333334 | 0 |
| 0.8965277777777777 | 0 |
| 0.8972222222222223 | 0 |
| 0.8979166666666667 | 0 |
| 0.8986111111111111 | 0 |
| 0.8993055555555555 | 0 |
| 0.9 | 0 |
| 0.9006944444444445 | 0 |
| 0.9013888888888889 | 0 |
| 0.9020833333333332 | 0 |
| 0.9027777777777778 | 0 |
| 0.9034722222222222 | 0 |
| 0.9041666666666667 | 0 |
| 0.904861111111111 | 0 |
| 0.9055555555555556 | 0 |
| 0.90625 | 0 |
| 0.9069444444444444 | 0 |
| 0.907638888888889 | 0 |
| 0.9083333333333333 | 0 |
| 0.9090277777777778 | 0 |
| 0.9097222222222222 | 0 |
| 0.9104166666666668 | 0 |
| 0.9111111111111111 | 0 |
| 0.9118055555555555 | 0 |
| 0.9125 | 0 |
| 0.9131944444444445 | 0 |
| 0.9138888888888889 | 0 |
| 0.9145833333333333 | 0 |
| 0.9152777777777777 | 0 |
| 0.9159722222222223 | 0 |
| 0.9166666666666666 | 0 |
| 0.9173611111111111 | 0 |
| 0.9180555555555556 | 0 |
| 0.9187500000000001 | 0 |
| 0.9194444444444444 | 0 |
| 0.9201388888888888 | 0 |
| 0.9208333333333334 | 0 |
| 0.9215277777777778 | 0 |
| 0.9222222222222222 | 0 |
| 0.9229166666666666 | 0 |
| 0.9236111111111112 | 0 |
| 0.9243055555555556 | 0 |
| 0.9249999999999999 | 0 |
| 0.9256944444444444 | 0 |
| 0.9263888888888889 | 0 |
| 0.9270833333333334 | 0 |
| 0.9277777777777777 | 0 |
| 0.9284722222222223 | 0 |
| 0.9291666666666667 | 0 |
| 0.9298611111111111 | 0 |
| 0.9305555555555555 | 0 |
| 0.93125 | 0 |
| 0.9319444444444445 | 0 |
| 0.9326388888888889 | 0 |
| 0.9333333333333332 | 0 |
| 0.9340277777777778 | 0 |
| 0.9347222222222222 | 0 |
| 0.9354166666666667 | 0 |
| 0.936111111111111 | 0 |
| 0.9368055555555556 | 0 |
| 0.9375 | 0 |
| 0.9381944444444444 | 0 |
| 0.938888888888889 | 0 |
| 0.9395833333333333 | 0 |
| 0.9402777777777778 | 0 |
| 0.9409722222222222 | 0 |
| 0.9416666666666668 | 0 |
| 0.9423611111111111 | 0 |
| 0.9430555555555555 | 0 |
| 0.94375 | 0 |
| 0.9444444444444445 | 0 |
| 0.9451388888888889 | 0 |
| 0.9458333333333333 | 0 |
| 0.9465277777777777 | 0 |
| 0.9472222222222223 | 0 |
| 0.9479166666666666 | 0 |
| 0.9486111111111111 | 0 |
| 0.9493055555555556 | 0 |
| 0.9500000000000001 | 0 |
| 0.9506944444444444 | 0 |
| 0.9513888888888888 | 0 |
| 0.9520833333333334 | 0 |
| 0.9527777777777778 | 0 |
| 0.9534722222222222 | 0 |
| 0.9541666666666666 | 0 |
| 0.9548611111111112 | 0 |
| 0.9555555555555556 | 0 |
| 0.9562499999999999 | 0 |
| 0.9569444444444444 | 0 |
| 0.9576388888888889 | 0 |
| 0.9583333333333334 | 0 |
| 0.9590277777777777 | 0 |
| 0.9597222222222223 | 0 |
| 0.9604166666666667 | 0 |
| 0.9611111111111111 | 0 |
| 0.9618055555555555 | 0 |
| 0.9625 | 0 |
| 0.9631944444444445 | 0 |
| 0.9638888888888889 | 0 |
| 0.9645833333333332 | 0 |
| 0.9652777777777778 | 0 |
| 0.9659722222222222 | 0 |
| 0.9666666666666667 | 0 |
| 0.967361111111111 | 0 |
| 0.9680555555555556 | 0 |
| 0.96875 | 0 |
| 0.9694444444444444 | 0 |
| 0.970138888888889 | 0 |
| 0.9708333333333333 | 0 |
| 0.9715277777777778 | 0 |
| 0.9722222222222222 | 0 |
| 0.9729166666666668 | 0 |
| 0.9736111111111111 | 0 |
| 0.9743055555555555 | 0 |
| 0.975 | 0 |
| 0.9756944444444445 | 0 |
| 0.9763888888888889 | 0 |
| 0.9770833333333333 | 0 |
| 0.9777777777777777 | 0 |
| 0.9784722222222223 | 0 |
| 0.9791666666666666 | 0 |
| 0.9798611111111111 | 0 |
| 0.9805555555555556 | 0 |
| 0.9812500000000001 | 0 |
| 0.9819444444444444 | 0 |
| 0.9826388888888888 | 0 |
| 0.9833333333333334 | 0 |
| 0.9840277777777778 | 0 |
| 0.9847222222222222 | 0 |
| 0.9854166666666666 | 0 |
| 0.9861111111111112 | 0 |
| 0.9868055555555556 | 0 |
| 0.9874999999999999 | 0 |
| 0.9881944444444444 | 0 |
| 0.9888888888888889 | 0 |
| 0.9895833333333334 | 0 |
| 0.9902777777777777 | 0 |
| 0.9909722222222223 | 0 |
| 0.9916666666666667 | 0 |
| 0.9923611111111111 | 0 |
| 0.9930555555555555 | 0 |
| 0.99375 | 0 |
| 0.9944444444444445 | 0 |
| 0.9951388888888889 | 0 |
| 0.9958333333333332 | 0 |
| 0.9965277777777778 | 0 |
| 0.9972222222222222 | 0 |
| 0.9979166666666667 | 0 |
| 0.998611111111111 | 0 |
| 0.9993055555555556 | 0 |